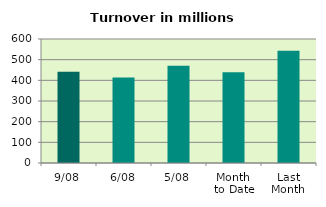
| Category | Series 0 |
|---|---|
| 9/08 | 441.871 |
| 6/08 | 414.221 |
| 5/08 | 470.321 |
| Month 
to Date | 438.753 |
| Last
Month | 542.77 |